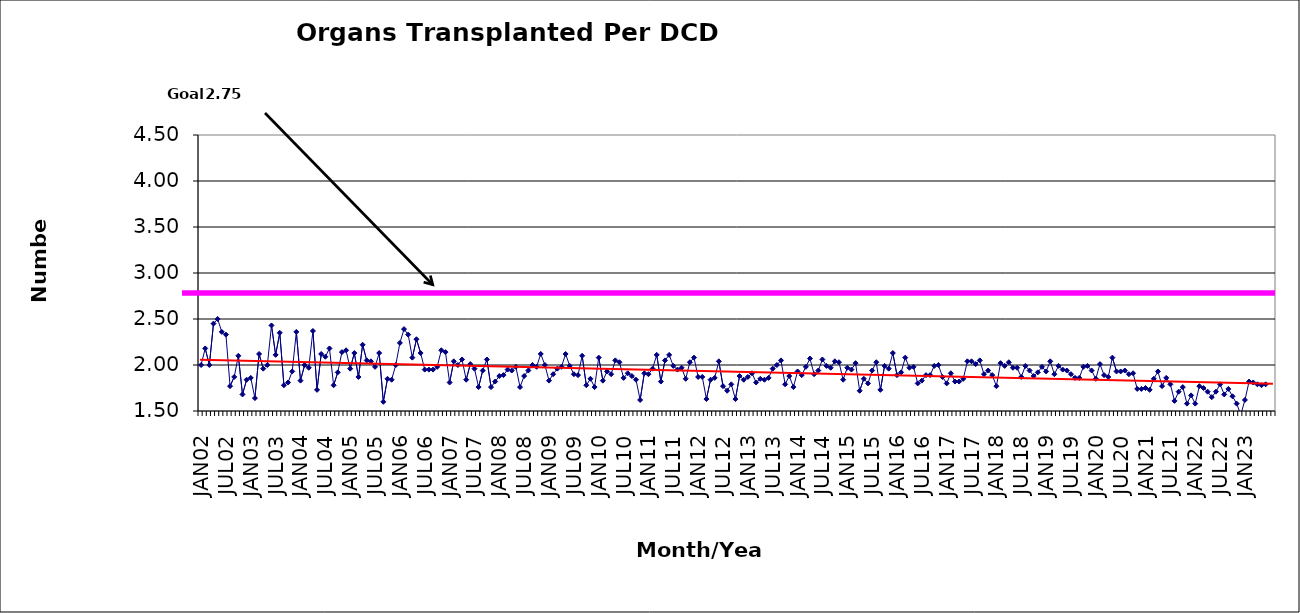
| Category | Series 0 |
|---|---|
| JAN02 | 2 |
| FEB02 | 2.18 |
| MAR02 | 2 |
| APR02 | 2.45 |
| MAY02 | 2.5 |
| JUN02 | 2.36 |
| JUL02 | 2.33 |
| AUG02 | 1.77 |
| SEP02 | 1.87 |
| OCT02 | 2.1 |
| NOV02 | 1.68 |
| DEC02 | 1.84 |
| JAN03 | 1.86 |
| FEB03 | 1.64 |
| MAR03 | 2.12 |
| APR03 | 1.96 |
| MAY03 | 2 |
| JUN03 | 2.43 |
| JUL03 | 2.11 |
| AUG03 | 2.35 |
| SEP03 | 1.78 |
| OCT03 | 1.81 |
| NOV03 | 1.93 |
| DEC03 | 2.36 |
| JAN04 | 1.83 |
| FEB04 | 2 |
| MAR04 | 1.97 |
| APR04 | 2.37 |
| MAY04 | 1.73 |
| JUN04 | 2.12 |
| JUL04 | 2.09 |
| AUG04 | 2.18 |
| SEP04 | 1.78 |
| OCT04 | 1.92 |
| NOV04 | 2.14 |
| DEC04 | 2.16 |
| JAN05 | 1.96 |
| FEB05 | 2.13 |
| MAR05 | 1.87 |
| APR05 | 2.22 |
| MAY05 | 2.05 |
| JUN05 | 2.04 |
| JUL05 | 1.98 |
| AUG05 | 2.13 |
| SEP05 | 1.6 |
| OCT05 | 1.85 |
| NOV05 | 1.84 |
| DEC05 | 2 |
| JAN06 | 2.24 |
| FEB06 | 2.39 |
| MAR06 | 2.33 |
| APR06 | 2.08 |
| MAY06 | 2.28 |
| JUN06 | 2.13 |
| JUL06 | 1.95 |
| AUG06 | 1.95 |
| SEP06 | 1.95 |
| OCT06 | 1.98 |
| NOV06 | 2.16 |
| DEC06 | 2.14 |
| JAN07 | 1.81 |
| FEB07 | 2.04 |
| MAR07 | 2 |
| APR07 | 2.06 |
| MAY07 | 1.84 |
| JUN07 | 2.01 |
| JUL07 | 1.96 |
| AUG07 | 1.76 |
| SEP07 | 1.94 |
| OCT07 | 2.06 |
| NOV07 | 1.76 |
| DEC07 | 1.82 |
| JAN08 | 1.88 |
| FEB08 | 1.89 |
| MAR08 | 1.95 |
| APR08 | 1.94 |
| MAY08 | 1.98 |
| JUN08 | 1.76 |
| JUL08 | 1.88 |
| AUG08 | 1.94 |
| SEP08 | 2 |
| OCT08 | 1.98 |
| NOV08 | 2.12 |
| DEC08 | 2 |
| JAN09 | 1.83 |
| FEB09 | 1.9 |
| MAR09 | 1.96 |
| APR09 | 1.98 |
| MAY09 | 2.12 |
| JUN09 | 1.99 |
| JUL09 | 1.9 |
| AUG09 | 1.89 |
| SEP09 | 2.1 |
| OCT09 | 1.78 |
| NOV09 | 1.85 |
| DEC09 | 1.76 |
| JAN10 | 2.08 |
| FEB10 | 1.83 |
| MAR10 | 1.93 |
| APR10 | 1.9 |
| MAY10 | 2.05 |
| JUN10 | 2.03 |
| JUL10 | 1.86 |
| AUG10 | 1.91 |
| SEP10 | 1.88 |
| OCT10 | 1.84 |
| NOV10 | 1.62 |
| DEC10 | 1.91 |
| JAN11 | 1.9 |
| FEB11 | 1.96 |
| MAR11 | 2.11 |
| APR11 | 1.82 |
| MAY11 | 2.05 |
| JUN11 | 2.11 |
| JUL11 | 1.99 |
| AUG11 | 1.95 |
| SEP11 | 1.97 |
| OCT11 | 1.85 |
| NOV11 | 2.03 |
| DEC11 | 2.08 |
| JAN12 | 1.87 |
| FEB12 | 1.87 |
| MAR12 | 1.63 |
| APR12 | 1.84 |
| MAY12 | 1.86 |
| JUN12 | 2.04 |
| JUL12 | 1.77 |
| AUG12 | 1.72 |
| SEP12 | 1.79 |
| OCT12 | 1.63 |
| NOV12 | 1.88 |
| DEC12 | 1.84 |
| JAN13 | 1.87 |
| FEB13 | 1.91 |
| MAR13 | 1.81 |
| APR13 | 1.85 |
| MAY13 | 1.84 |
| JUN13 | 1.86 |
| JUL13 | 1.96 |
| AUG13 | 2 |
| SEP13 | 2.05 |
| OCT13 | 1.79 |
| NOV13 | 1.88 |
| DEC13 | 1.76 |
| JAN14 | 1.93 |
| FEB14 | 1.89 |
| MAR14 | 1.98 |
| APR14 | 2.07 |
| MAY14 | 1.9 |
| JUN14 | 1.94 |
| JUL14 | 2.06 |
| AUG14 | 1.99 |
| SEP14 | 1.97 |
| OCT14 | 2.04 |
| NOV14 | 2.03 |
| DEC14 | 1.84 |
| JAN15 | 1.97 |
| FEB15 | 1.95 |
| MAR15 | 2.02 |
| APR15 | 1.72 |
| MAY15 | 1.85 |
| JUN15 | 1.8 |
| JUL15 | 1.94 |
| AUG15 | 2.03 |
| SEP15 | 1.73 |
| OCT15 | 1.99 |
| NOV15 | 1.96 |
| DEC15 | 2.13 |
| JAN16 | 1.89 |
| FEB16 | 1.92 |
| MAR16 | 2.08 |
| APR16 | 1.97 |
| MAY16 | 1.98 |
| JUN16 | 1.8 |
| JUL16 | 1.83 |
| AUG16 | 1.89 |
| SEP16 | 1.89 |
| OCT16 | 1.99 |
| NOV16 | 2 |
| DEC16 | 1.87 |
| JAN17 | 1.8 |
| FEB17 | 1.91 |
| MAR17 | 1.82 |
| APR17 | 1.82 |
| MAY17 | 1.85 |
| JUN17 | 2.04 |
| JUL17 | 2.04 |
| AUG17 | 2.01 |
| SEP17 | 2.05 |
| OCT17 | 1.9 |
| NOV17 | 1.94 |
| DEC17 | 1.89 |
| JAN18 | 1.77 |
| FEB18 | 2.02 |
| MAR18 | 1.99 |
| APR18 | 2.03 |
| MAY18 | 1.97 |
| JUN18 | 1.97 |
| JUL18 | 1.87 |
| AUG18 | 1.99 |
| SEP18 | 1.94 |
| OCT18 | 1.88 |
| NOV18 | 1.92 |
| DEC18 | 1.98 |
| JAN19 | 1.93 |
| FEB19 | 2.04 |
| MAR19 | 1.9 |
| APR19 | 1.99 |
| MAY19 | 1.95 |
| JUN19 | 1.94 |
| JUL19 | 1.9 |
| AUG19 | 1.86 |
| SEP19 | 1.86 |
| OCT19 | 1.98 |
| NOV19 | 1.99 |
| DEC19 | 1.94 |
| JAN20 | 1.85 |
| FEB20 | 2.01 |
| MAR20 | 1.89 |
| APR20 | 1.87 |
| MAY20 | 2.08 |
| JUN20 | 1.93 |
| JUL20 | 1.93 |
| AUG20 | 1.94 |
| SEP20 | 1.9 |
| OCT20 | 1.91 |
| NOV20 | 1.74 |
| DEC20 | 1.74 |
| JAN21 | 1.75 |
| FEB21 | 1.73 |
| MAR21 | 1.85 |
| APR21 | 1.93 |
| MAY21 | 1.77 |
| JUN21 | 1.86 |
| JUL21 | 1.79 |
| AUG21 | 1.61 |
| SEP21 | 1.71 |
| OCT21 | 1.76 |
| NOV21 | 1.58 |
| DEC21 | 1.67 |
| JAN22 | 1.58 |
| FEB22 | 1.77 |
| MAR22 | 1.75 |
| APR22 | 1.71 |
| MAY22 | 1.65 |
| JUN22 | 1.71 |
| JUL22 | 1.79 |
| AUG22 | 1.68 |
| SEP22 | 1.74 |
| OCT22 | 1.66 |
| NOV22 | 1.58 |
| DEC22 | 1.46 |
| JAN23 | 1.62 |
| FEB23 | 1.82 |
| MAR23 | 1.81 |
| APR23 | 1.79 |
| MAY23 | 1.78 |
| JUN23 | 1.79 |